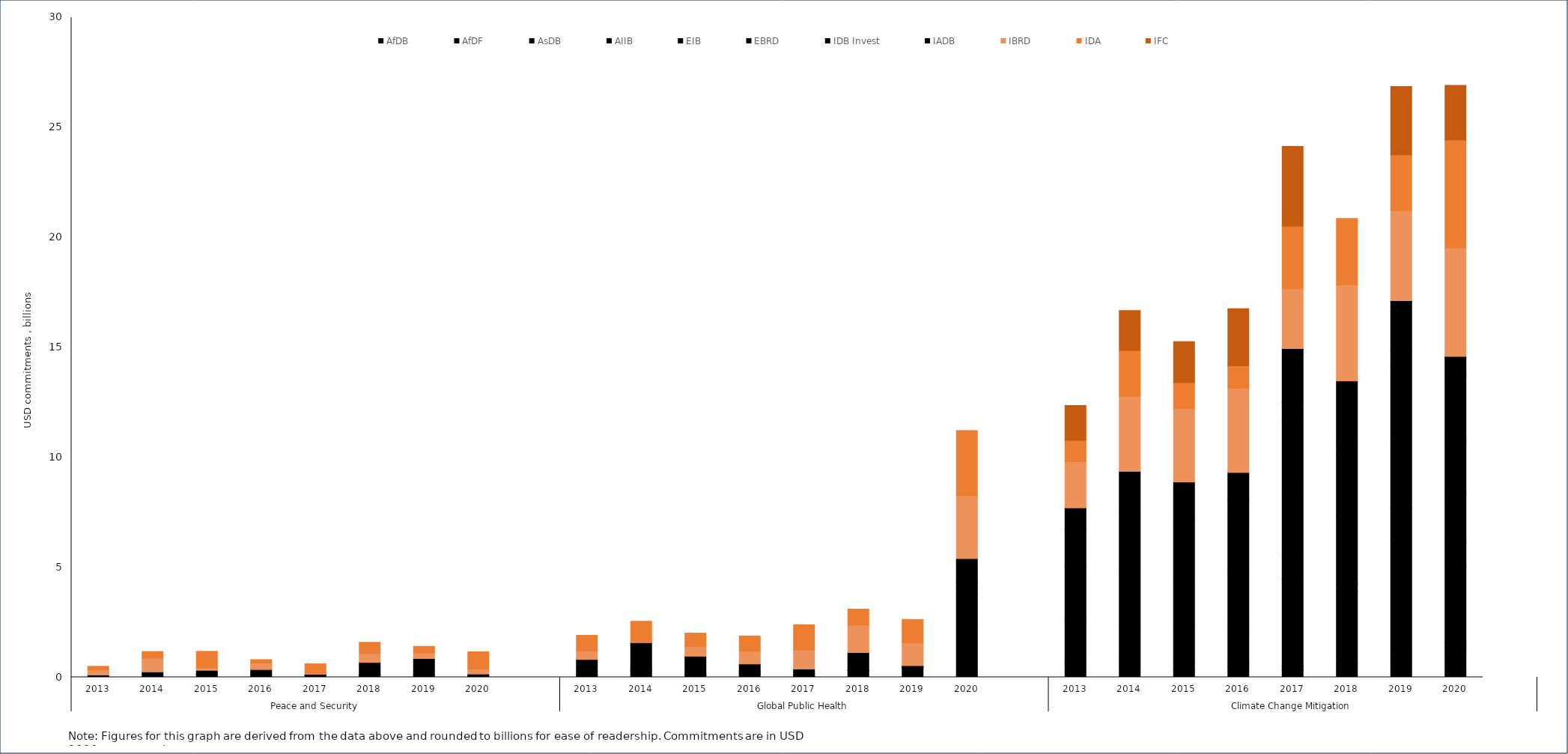
| Category | AfDB | AfDF | AsDB | AIIB | EIB | EBRD | IDB Invest | IADB | IBRD | IDA | IFC |
|---|---|---|---|---|---|---|---|---|---|---|---|
| 0 | 0 | 0 | 2.435 | 0 | 0 | 0 | 0 | 98.29 | 230.402 | 168.1 | 0 |
| 1 | 0 | 0 | 2 | 0 | 0 | 0 | 0 | 242.067 | 621.18 | 303.601 | 0 |
| 2 | 0 | 1.377 | 125.179 | 0 | 16.639 | 0 | 0 | 172.33 | 107 | 757.397 | 0 |
| 3 | 0 | 13.192 | 1.764 | 0 | 110.583 | 0 | 0 | 224.62 | 297.032 | 155.608 | 0 |
| 4 | 66.489 | 7.55 | 1.498 | 0 | 60.174 | 0 | 0 | 0 | 27.45 | 447.204 | 0 |
| 5 | 76.374 | 28.325 | 6.045 | 0 | 38.375 | 0 | 0 | 523.743 | 414.044 | 503.88 | 0 |
| 6 | 1.494 | 87.939 | 14.439 | 0 | 0 | 0 | 0 | 745.997 | 254.85 | 300.343 | 0 |
| 7 | 0 | 0 | 22.595 | 0 | 34.188 | 0 | 0 | 89.095 | 234.03 | 777.726 | 0 |
| 8 | 0 | 0 | 0 | 0 | 0 | 0 | 0 | 0 | 0 | 0 | 0 |
| 9 | 1.565 | 0 | 76.225 | 0 | 0 | 26.553 | 0 | 706.795 | 380.082 | 714.64 | 0 |
| 10 | 6.28 | 276.819 | 64.713 | 0 | 0 | 62.319 | 0 | 1163.979 | 42.7 | 930.463 | 0 |
| 11 | 1.009 | 88.604 | 10.319 | 0 | 0 | 76.354 | 0 | 780.595 | 434.451 | 615.292 | 0 |
| 12 | 139.928 | 0 | 39.135 | 0 | 0 | 78.076 | 0.118 | 347.23 | 580.234 | 691.668 | 0 |
| 13 | 0 | 8.751 | 74.684 | 0 | 0.604 | 101.075 | 0 | 187.818 | 870.423 | 1138.412 | 0 |
| 14 | 1.018 | 0 | 307.17 | 0 | 5.618 | 2.36 | 0 | 807.536 | 1245.148 | 729.363 | 0 |
| 15 | 0 | 0 | 413.684 | 0 | 4.811 | 51.072 | 10 | 49.519 | 1033.357 | 1065.593 | 0 |
| 16 | 2.889 | 115.204 | 2174.442 | 1494.9 | 262.108 | 225.115 | 44.298 | 1082.071 | 2857.968 | 2957.96 | 0 |
| 17 | 0 | 0 | 0 | 0 | 0 | 0 | 0 | 0 | 0 | 0 | 0 |
| 18 | 233.58 | 384.65 | 1998.161 | 0 | 2431.335 | 1632.504 | 0 | 1025.222 | 2103.369 | 967.675 | 1585.386 |
| 19 | 728.545 | 163.772 | 1490.475 | 0 | 2530.729 | 2602.507 | 0 | 1852.238 | 3415.788 | 2082.444 | 1812.681 |
| 20 | 329.862 | 307.168 | 1732.639 | 0 | 2214.987 | 2542.346 | 0 | 1750.03 | 3338.333 | 1184.242 | 1861.347 |
| 21 | 503.739 | 190.77 | 1386.491 | 388.315 | 2257.616 | 2545.266 | 780.464 | 1262.346 | 3831.579 | 1018.516 | 2596.384 |
| 22 | 336.555 | 179.614 | 3943.544 | 1078.871 | 2923.752 | 3199.852 | 853.296 | 2431.24 | 2717.29 | 2848.241 | 3630.227 |
| 23 | 458.641 | 127.966 | 3274.927 | 372.991 | 3126.332 | 2784.824 | 550.476 | 2782.503 | 4361.548 | 3025.469 | 0 |
| 24 | 838.86 | 137.673 | 5298.85 | 1393.085 | 3192.889 | 3268.113 | 719.353 | 2279.186 | 4104.532 | 2531.225 | 3105.479 |
| 25 | 1377.07 | 184.739 | 3500.006 | 1001.272 | 2361.264 | 2258.43 | 2990.045 | 920.316 | 4937.082 | 4901.739 | 2482.079 |